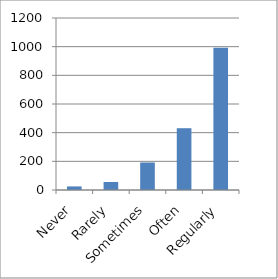
| Category | Series 0 |
|---|---|
| Never | 25 |
| Rarely | 56 |
| Sometimes | 192 |
| Often | 431 |
| Regularly | 992 |